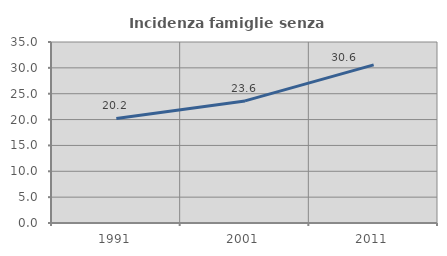
| Category | Incidenza famiglie senza nuclei |
|---|---|
| 1991.0 | 20.209 |
| 2001.0 | 23.612 |
| 2011.0 | 30.584 |